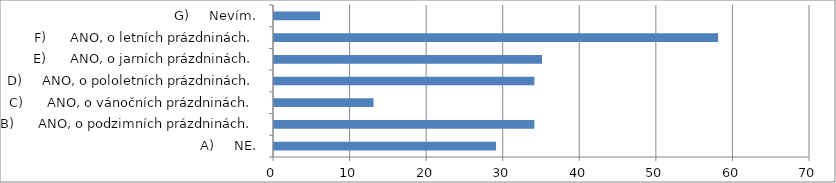
| Category | Series 0 |
|---|---|
| A)     NE. | 29 |
| B)      ANO, o podzimních prázdninách. | 34 |
| C)      ANO, o vánočních prázdninách. | 13 |
| D)     ANO, o pololetních prázdninách. | 34 |
| E)      ANO, o jarních prázdninách. | 35 |
| F)      ANO, o letních prázdninách. | 58 |
| G)     Nevím. | 6 |